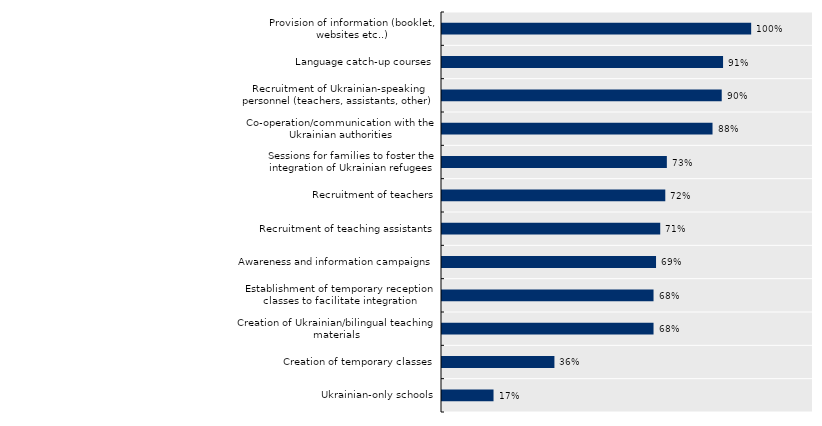
| Category | Series 0 |
|---|---|
| Ukrainian-only schools | 0.167 |
| Creation of temporary classes | 0.364 |
| Creation of Ukrainian/bilingual teaching materials | 0.684 |
| Establishment of temporary reception classes to facilitate integration | 0.684 |
| Awareness and information campaigns | 0.692 |
| Recruitment of teaching assistants | 0.706 |
| Recruitment of teachers | 0.722 |
| Sessions for families to foster the integration of Ukrainian refugees | 0.727 |
| Co-operation/communication with the Ukrainian authorities | 0.875 |
| Recruitment of Ukrainian-speaking personnel (teachers, assistants, other) | 0.905 |
| Language catch-up courses | 0.909 |
| Provision of information (booklet, websites etc..) | 1 |